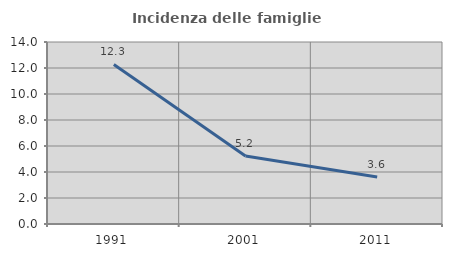
| Category | Incidenza delle famiglie numerose |
|---|---|
| 1991.0 | 12.27 |
| 2001.0 | 5.226 |
| 2011.0 | 3.611 |